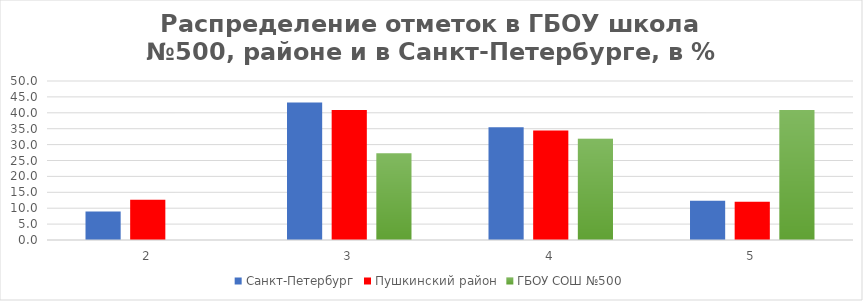
| Category | Санкт-Петербург | Пушкинский район | ГБОУ СОШ №500 |
|---|---|---|---|
| 2.0 | 9 | 12.66 | 0 |
| 3.0 | 43.24 | 40.91 | 27.27 |
| 4.0 | 35.43 | 34.42 | 31.82 |
| 5.0 | 12.33 | 12.01 | 40.91 |